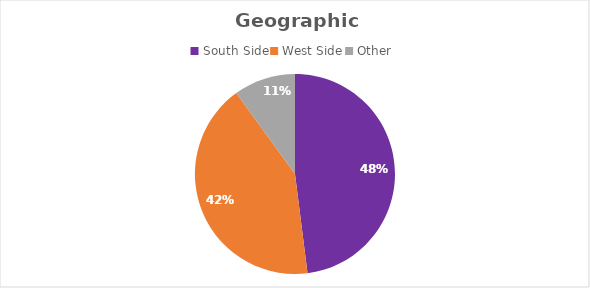
| Category | Series 0 |
|---|---|
| South Side | 24 |
| West Side | 21 |
| Other | 5 |